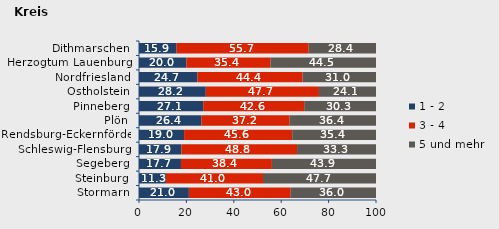
| Category | 1 - 2 | 3 - 4 | 5 und mehr |
|---|---|---|---|
| Stormarn | 21.043 | 42.971 | 35.986 |
| Steinburg | 11.337 | 40.988 | 47.674 |
| Segeberg | 17.707 | 38.365 | 43.927 |
| Schleswig-Flensburg | 17.905 | 48.788 | 33.307 |
| Rendsburg-Eckernförde | 19.024 | 45.618 | 35.359 |
| Plön | 26.357 | 37.209 | 36.434 |
| Pinneberg | 27.09 | 42.612 | 30.299 |
| Ostholstein | 28.191 | 47.739 | 24.069 |
| Nordfriesland | 24.677 | 44.355 | 30.968 |
| Herzogtum Lauenburg | 20.022 | 35.449 | 44.53 |
| Dithmarschen | 15.861 | 55.74 | 28.399 |